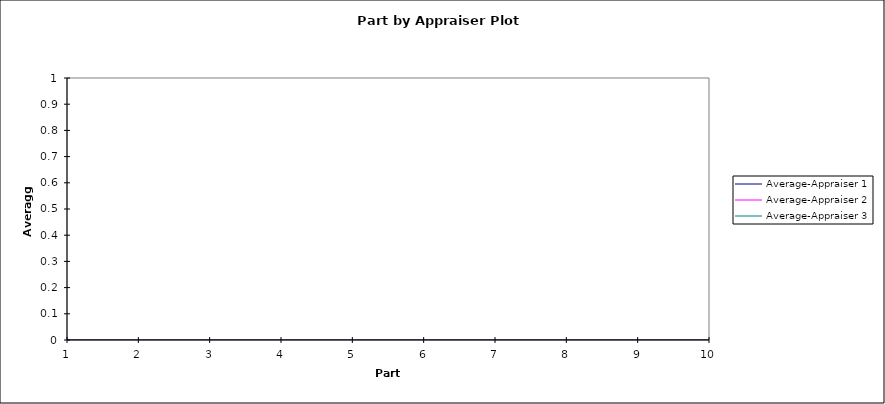
| Category | Average-Appraiser 1 | Average-Appraiser 2 | Average-Appraiser 3 | UCL | XCL | LCL |
|---|---|---|---|---|---|---|
| 1 | 0 | 0 | 0 |  |  |  |
| 2 | 0 | 0 | 0 |  |  |  |
| 3 | 0 | 0 | 0 |  |  |  |
| 4 | 0 | 0 | 0 |  |  |  |
| 5 | 0 | 0 | 0 |  |  |  |
| 6 | 0 | 0 | 0 |  |  |  |
| 7 | 0 | 0 | 0 |  |  |  |
| 8 | 0 | 0 | 0 |  |  |  |
| 9 | 0 | 0 | 0 |  |  |  |
| 10 | 0 | 0 | 0 |  |  |  |